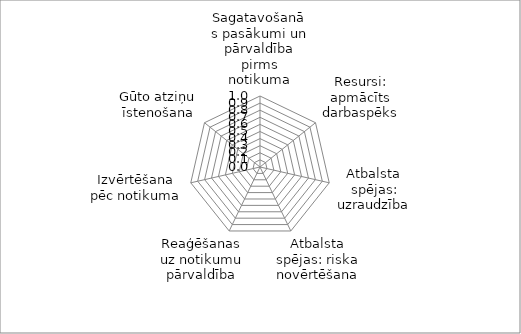
| Category | Series 0 |
|---|---|
| Sagatavošanās pasākumi un pārvaldība pirms notikuma | 0 |
| Resursi: apmācīts darbaspēks | 0 |
| Atbalsta spējas: uzraudzība | 0 |
| Atbalsta spējas: riska novērtēšana | 0 |
| Reaģēšanas uz notikumu pārvaldība | 0 |
| Izvērtēšana pēc notikuma | 0 |
| Gūto atziņu īstenošana | 0 |